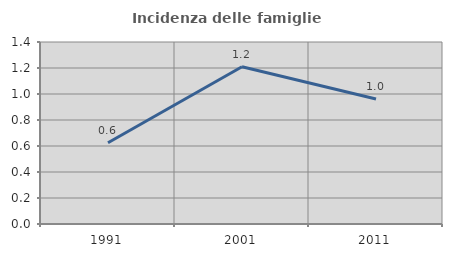
| Category | Incidenza delle famiglie numerose |
|---|---|
| 1991.0 | 0.625 |
| 2001.0 | 1.21 |
| 2011.0 | 0.962 |